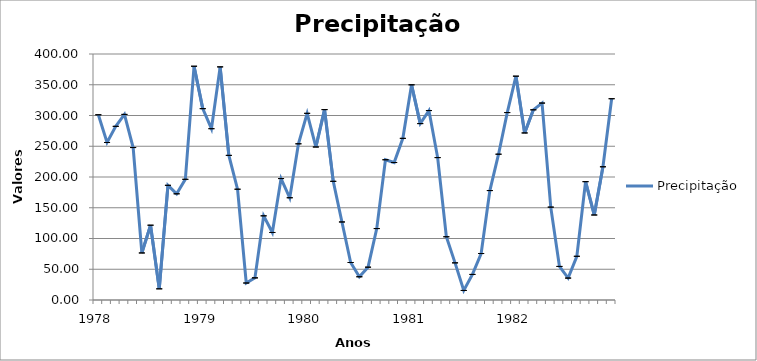
| Category | Precipitação |
|---|---|
| 1978.0 | 301.174 |
| nan | 256.122 |
| nan | 282.385 |
| nan | 301.8 |
| nan | 247.889 |
| nan | 76.481 |
| nan | 121.646 |
| nan | 18.162 |
| nan | 186.48 |
| nan | 172.683 |
| nan | 196.251 |
| nan | 380.109 |
| 1979.0 | 311.152 |
| nan | 278.551 |
| nan | 379.075 |
| nan | 235.152 |
| nan | 180.149 |
| nan | 27.628 |
| nan | 35.996 |
| nan | 136.842 |
| nan | 109.801 |
| nan | 197.442 |
| nan | 166.265 |
| nan | 253.972 |
| 1980.0 | 303.509 |
| nan | 248.793 |
| nan | 309.57 |
| nan | 192.969 |
| nan | 126.881 |
| nan | 60.959 |
| nan | 37.785 |
| nan | 53.354 |
| nan | 116.143 |
| nan | 228.043 |
| nan | 223.55 |
| nan | 262.854 |
| 1981.0 | 349.888 |
| nan | 286.839 |
| nan | 308.033 |
| nan | 231.554 |
| nan | 102.811 |
| nan | 60.392 |
| nan | 15.54 |
| nan | 41.588 |
| nan | 75.567 |
| nan | 177.931 |
| nan | 237.088 |
| nan | 304.754 |
| 1982.0 | 363.972 |
| nan | 271.631 |
| nan | 309.227 |
| nan | 320.21 |
| nan | 151.029 |
| nan | 54.59 |
| nan | 35.656 |
| nan | 71.071 |
| nan | 192.411 |
| nan | 138.235 |
| nan | 216.625 |
| nan | 327.276 |